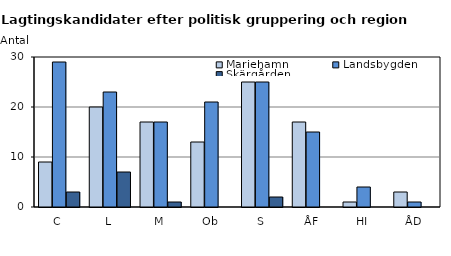
| Category | Mariehamn | Landsbygden | Skärgården |
|---|---|---|---|
| C | 9 | 29 | 3 |
| L | 20 | 23 | 7 |
| M | 17 | 17 | 1 |
| Ob | 13 | 21 | 0 |
| S | 25 | 25 | 2 |
| ÅF | 17 | 15 | 0 |
| HI | 1 | 4 | 0 |
| ÅD | 3 | 1 | 0 |